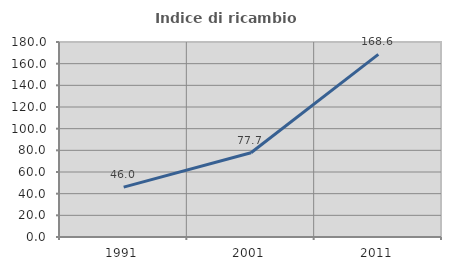
| Category | Indice di ricambio occupazionale  |
|---|---|
| 1991.0 | 46.008 |
| 2001.0 | 77.722 |
| 2011.0 | 168.588 |